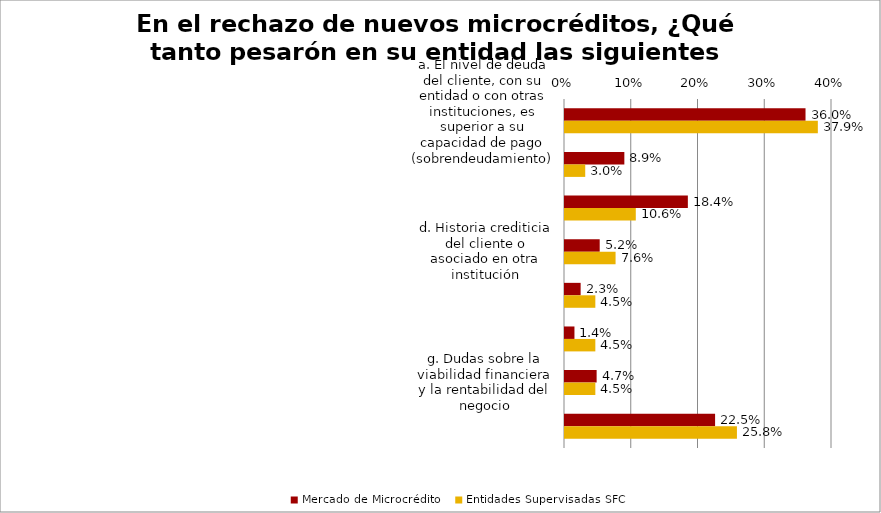
| Category | Mercado de Microcrédito | Entidades Supervisadas SFC |
|---|---|---|
| a. El nivel de deuda del cliente, con su entidad o con otras instituciones, es superior a su capacidad de pago (sobrendeudamiento) | 0.36 | 0.379 |
| b. Crédito con más de tres entidades | 0.089 | 0.03 |
| c. Mala historia crediticia | 0.184 | 0.106 |
| d. Historia crediticia del cliente o asociado en otra institución | 0.052 | 0.076 |
| e. Poco tiempo de creada la microempresa | 0.023 | 0.045 |
| f. Por sector productivo al cual pertenece el aplicante de crédito o del cual deriva sus principales fuentes de ingreso | 0.014 | 0.045 |
| g. Dudas sobre la viabilidad financiera y la rentabilidad del negocio | 0.047 | 0.045 |
| h. Capacidad de pago del cliente | 0.225 | 0.258 |